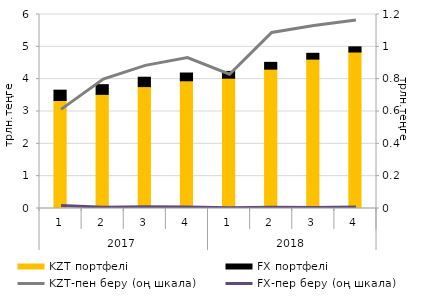
| Category | KZT портфелі | FX портфелі |
|---|---|---|
| 0 | 3.34 | 0.32 |
| 1 | 3.53 | 0.3 |
| 2 | 3.77 | 0.29 |
| 3 | 3.95 | 0.24 |
| 4 | 4.03 | 0.21 |
| 5 | 4.31 | 0.21 |
| 6 | 4.62 | 0.18 |
| 7 | 4.84 | 0.16 |